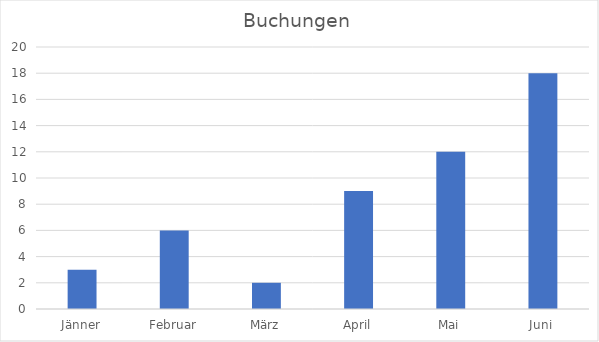
| Category | Buchungen |
|---|---|
| Jänner | 3 |
| Februar | 6 |
| März | 2 |
| April | 9 |
| Mai | 12 |
| Juni | 18 |